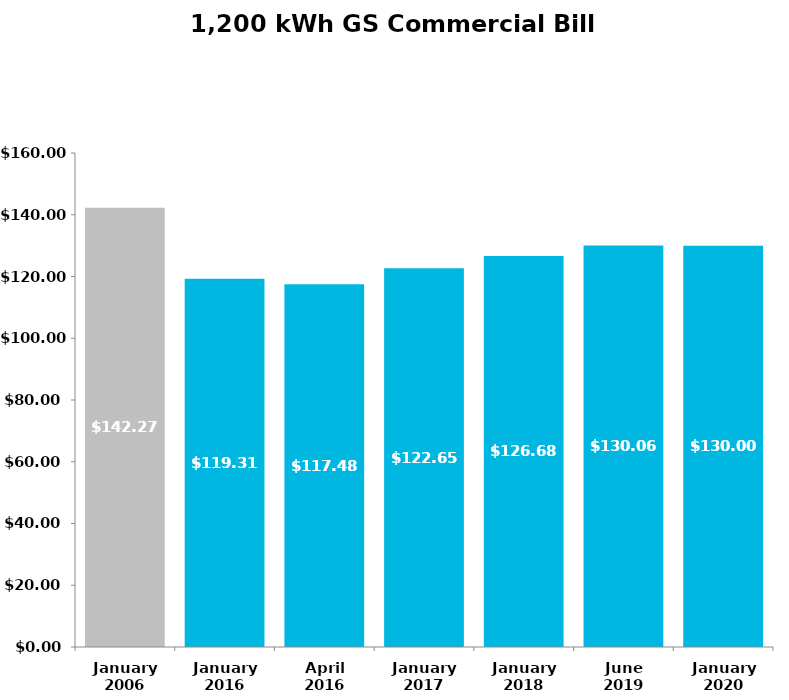
| Category | Total | Series 1 | Series 2 | Series 3 |
|---|---|---|---|---|
| January
2006 | 142.27 |  |  |  |
| January
2016 | 119.31 |  |  |  |
| April
2016 | 117.48 |  |  |  |
| January
2017 | 122.65 |  |  |  |
| January
2018 | 126.68 |  |  |  |
| June
2019 | 130.06 |  |  |  |
| January
2020 | 130 |  |  |  |